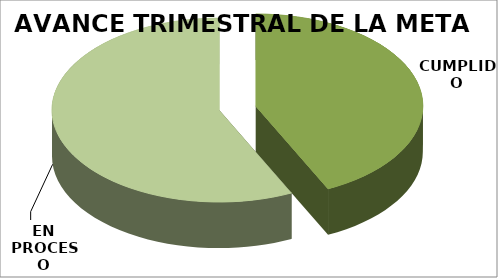
| Category | AVANCE TRIMESTRAL DE LA META |
|---|---|
| CUMPLIDO | 343 |
| EN PROCESO | 457 |